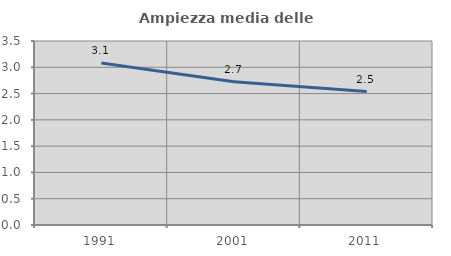
| Category | Ampiezza media delle famiglie |
|---|---|
| 1991.0 | 3.08 |
| 2001.0 | 2.727 |
| 2011.0 | 2.539 |